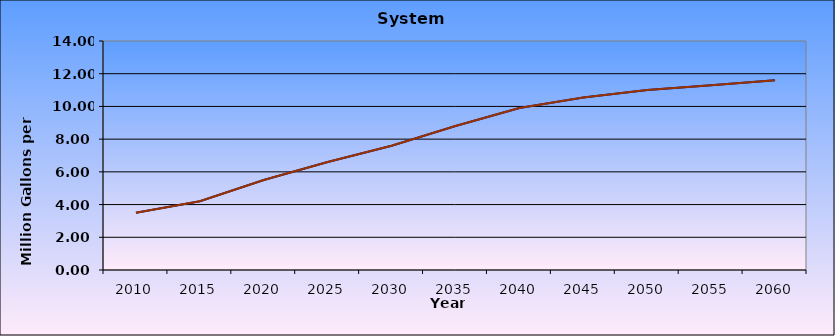
| Category | Series 0 | Series 1 |
|---|---|---|
| 2010.0 | 3.5 | 3.5 |
| 2015.0 | 4.2 | 4.2 |
| 2020.0 | 5.5 | 5.5 |
| 2025.0 | 6.6 | 6.6 |
| 2030.0 | 7.6 | 7.6 |
| 2035.0 | 8.8 | 8.8 |
| 2040.0 | 9.9 | 9.9 |
| 2045.0 | 10.55 | 10.55 |
| 2050.0 | 11 | 11 |
| 2055.0 | 11.3 | 11.3 |
| 2060.0 | 11.6 | 11.6 |